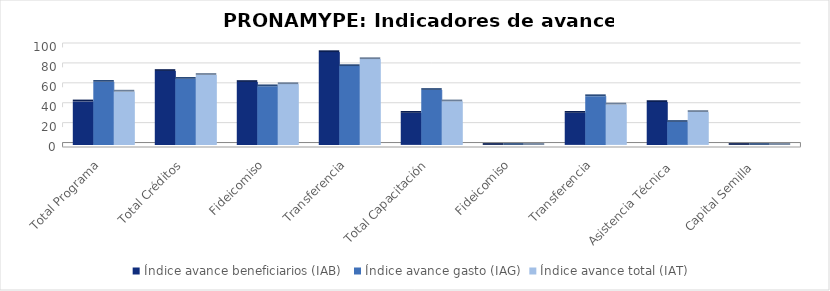
| Category | Índice avance beneficiarios (IAB)  | Índice avance gasto (IAG) | Índice avance total (IAT)  |
|---|---|---|---|
| Total Programa | 43.713 | 63.418 | 53.566 |
| Total Créditos | 74.28 | 66.408 | 70.344 |
| Fideicomiso | 63.222 | 58.942 | 61.082 |
| Transferencia | 93.229 | 79.199 | 86.214 |
| Total Capacitación | 32.275 | 55.242 | 43.758 |
| Fideicomiso | 0 | 0 | 0 |
| Transferencia | 32.275 | 48.982 | 40.628 |
| Asistencia Técnica  | 43.077 | 23.092 | 33.084 |
| Capital Semilla  | 0 | 0 | 0 |